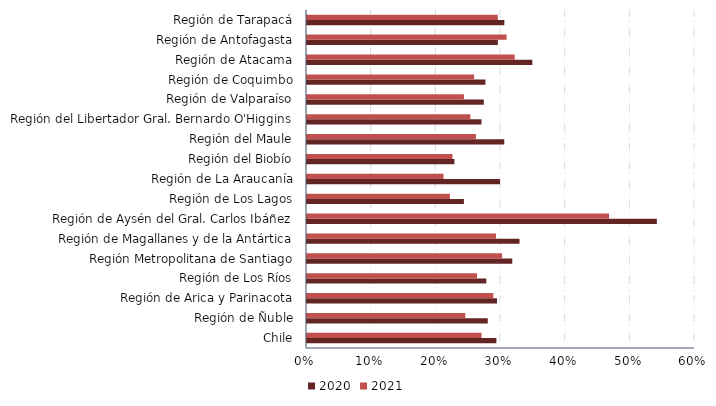
| Category | 2020 | 2021 |
|---|---|---|
| Chile | 0.293 | 0.27 |
| Región de Ñuble | 0.28 | 0.245 |
| Región de Arica y Parinacota | 0.294 | 0.288 |
| Región de Los Ríos | 0.277 | 0.263 |
| Región Metropolitana de Santiago | 0.317 | 0.302 |
| Región de Magallanes y de la Antártica | 0.329 | 0.292 |
| Región de Aysén del Gral. Carlos Ibáñez | 0.541 | 0.467 |
| Región de Los Lagos | 0.243 | 0.221 |
| Región de La Araucanía | 0.299 | 0.211 |
| Región del Biobío | 0.228 | 0.225 |
| Región del Maule | 0.305 | 0.261 |
| Región del Libertador Gral. Bernardo O'Higgins | 0.27 | 0.253 |
| Región de Valparaíso | 0.273 | 0.243 |
| Región de Coquimbo | 0.276 | 0.258 |
| Región de Atacama | 0.348 | 0.321 |
| Región de Antofagasta | 0.295 | 0.309 |
| Región de Tarapacá | 0.305 | 0.295 |